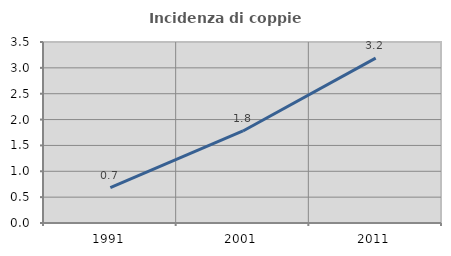
| Category | Incidenza di coppie miste |
|---|---|
| 1991.0 | 0.683 |
| 2001.0 | 1.779 |
| 2011.0 | 3.188 |